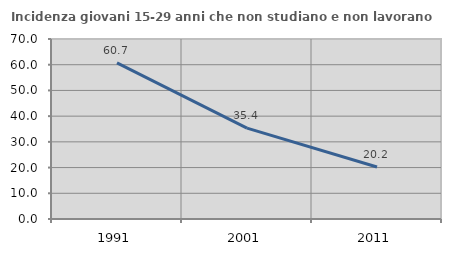
| Category | Incidenza giovani 15-29 anni che non studiano e non lavorano  |
|---|---|
| 1991.0 | 60.738 |
| 2001.0 | 35.354 |
| 2011.0 | 20.202 |